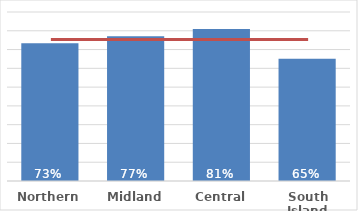
| Category | Dep 5 |
|---|---|
| Northern | 0.734 |
| Midland | 0.771 |
| Central | 0.81 |
| South Island | 0.651 |